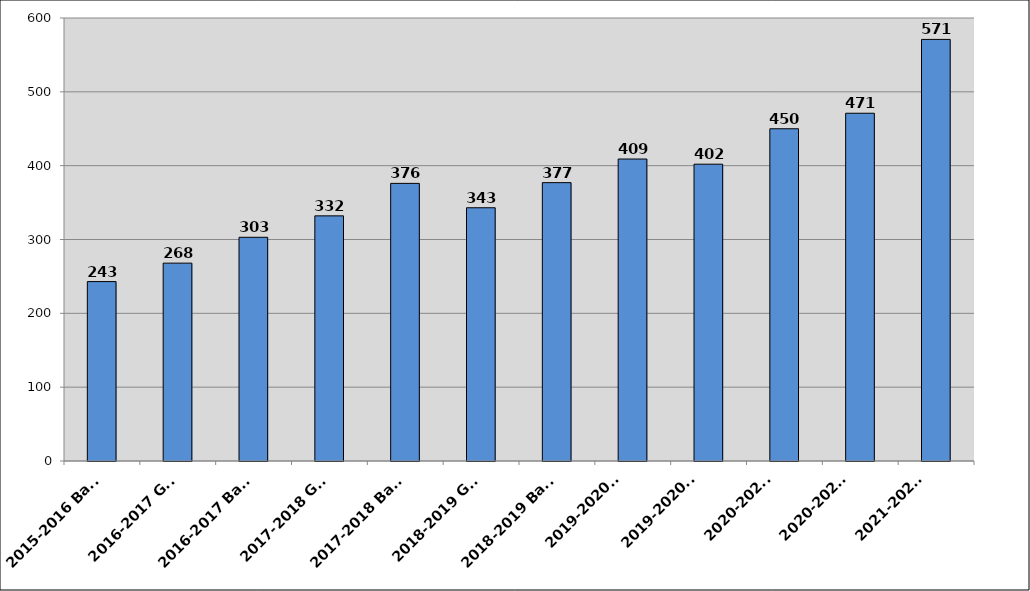
| Category | Series 0 |
|---|---|
| 2015-2016 Bahar | 243 |
| 2016-2017 Güz | 268 |
| 2016-2017 Bahar | 303 |
| 2017-2018 Güz | 332 |
| 2017-2018 Bahar | 376 |
| 2018-2019 Güz | 343 |
| 2018-2019 Bahar | 377 |
| 2019-2020 
Güz | 409 |
| 2019-2020 
Bahar | 402 |
| 2020-2021
Güz | 450 |
| 2020-2021
Bahar | 471 |
| 2021-2022
güz | 571 |